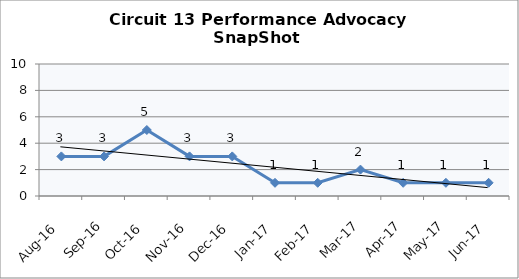
| Category | Circuit 13 |
|---|---|
| Aug-16 | 3 |
| Sep-16 | 3 |
| Oct-16 | 5 |
| Nov-16 | 3 |
| Dec-16 | 3 |
| Jan-17 | 1 |
| Feb-17 | 1 |
| Mar-17 | 2 |
| Apr-17 | 1 |
| May-17 | 1 |
| Jun-17 | 1 |